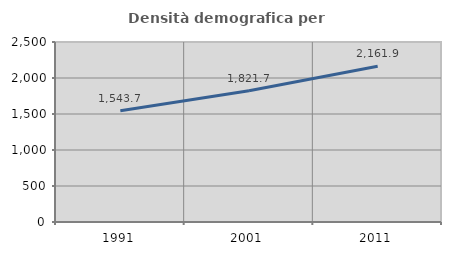
| Category | Densità demografica |
|---|---|
| 1991.0 | 1543.727 |
| 2001.0 | 1821.738 |
| 2011.0 | 2161.917 |